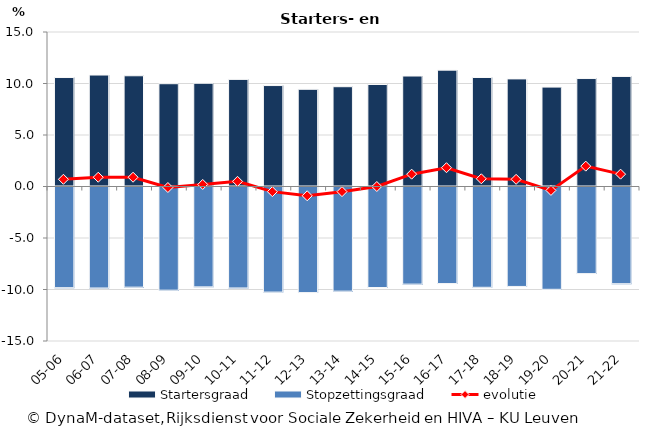
| Category | Startersgraad | Stopzettingsgraad |
|---|---|---|
| 21-22 | 10.685 | -9.486 |
| 20-21 | 10.481 | -8.503 |
| 19-20 | 9.65 | -10.03 |
| 18-19 | 10.447 | -9.751 |
| 17-18 | 10.582 | -9.834 |
| 16-17 | 11.296 | -9.471 |
| 15-16 | 10.726 | -9.528 |
| 14-15 | 9.902 | -9.856 |
| 13-14 | 9.688 | -10.208 |
| 12-13 | 9.437 | -10.347 |
| 11-12 | 9.8 | -10.3 |
| 10-11 | 10.4 | -9.9 |
| 09-10 | 10.024 | -9.792 |
| 08-09 | 9.979 | -10.115 |
| 07-08 | 10.751 | -9.82 |
| 06-07 | 10.821 | -9.904 |
| 05-06 | 10.58 | -9.873 |